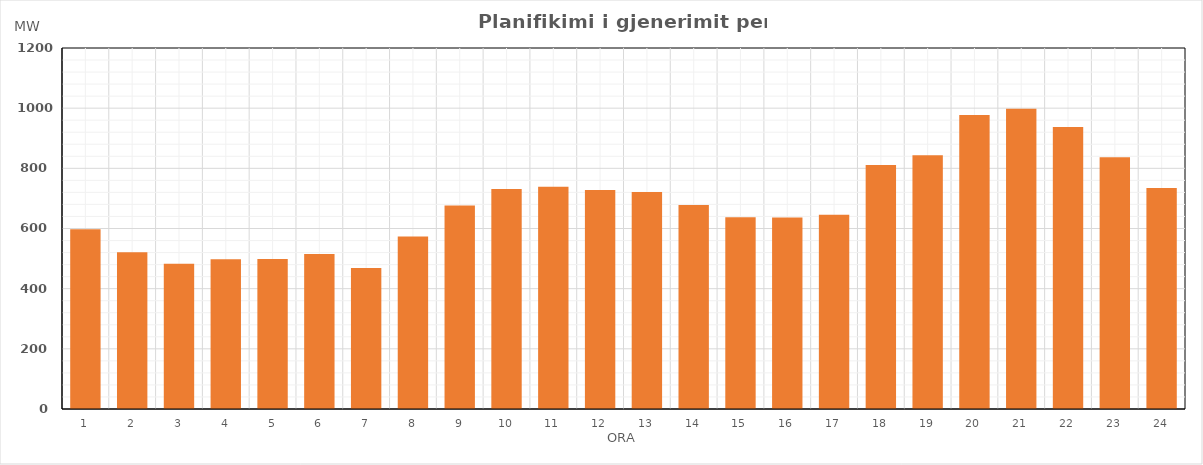
| Category | Max (MW) |
|---|---|
| 0 | 597.512 |
| 1 | 521.114 |
| 2 | 482.713 |
| 3 | 498.119 |
| 4 | 499.008 |
| 5 | 514.923 |
| 6 | 469.099 |
| 7 | 573.052 |
| 8 | 676.748 |
| 9 | 731.315 |
| 10 | 738.552 |
| 11 | 728.178 |
| 12 | 721.666 |
| 13 | 678.365 |
| 14 | 637.429 |
| 15 | 636.962 |
| 16 | 645.438 |
| 17 | 811.067 |
| 18 | 843.673 |
| 19 | 977.648 |
| 20 | 998.208 |
| 21 | 937.332 |
| 22 | 836.646 |
| 23 | 735.031 |